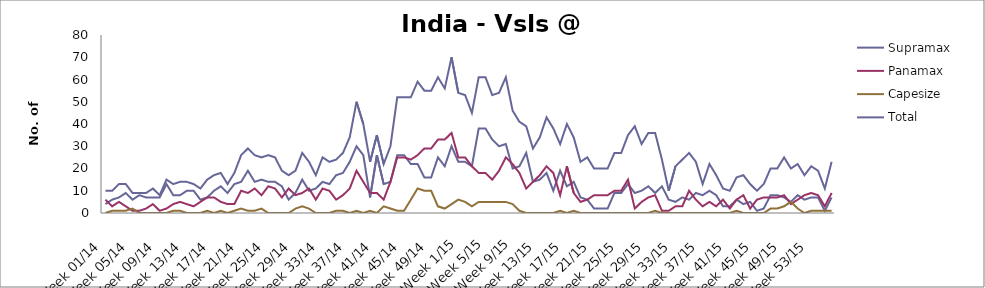
| Category | Supramax | Panamax | Capesize | Total |
|---|---|---|---|---|
| Week 01/14 | 4 | 6 | 0 | 10 |
| Week 02/14 | 6 | 3 | 1 | 10 |
| Week 03/14 | 7 | 5 | 1 | 13 |
| Week 04/14 | 9 | 3 | 1 | 13 |
| Week 05/14 | 6 | 1 | 2 | 9 |
| Week 06/14 | 8 | 1 | 0 | 9 |
| Week 07/14 | 7 | 2 | 0 | 9 |
| Week 08/14 | 7 | 4 | 0 | 11 |
| Week 09/14 | 7 | 1 | 0 | 8 |
| Week 10/14 | 13 | 2 | 0 | 15 |
| Week 11/14 | 8 | 4 | 1 | 13 |
| Week 12/14 | 8 | 5 | 1 | 14 |
| Week 13/14 | 10 | 4 | 0 | 14 |
| Week 14/14 | 10 | 3 | 0 | 13 |
| Week 15/14 | 6 | 5 | 0 | 11 |
| Week 16/14 | 7 | 7 | 1 | 15 |
| Week 17/14 | 10 | 7 | 0 | 17 |
| Week 18/14 | 12 | 5 | 1 | 18 |
| Week 19/14 | 9 | 4 | 0 | 13 |
| Week 20/14 | 13 | 4 | 1 | 18 |
| Week 21/14 | 14 | 10 | 2 | 26 |
| Week 22/14 | 19 | 9 | 1 | 29 |
| Week 23/14 | 14 | 11 | 1 | 26 |
| Week 24/14 | 15 | 8 | 2 | 25 |
| Week 25/14 | 14 | 12 | 0 | 26 |
| Week 26/14 | 14 | 11 | 0 | 25 |
| Week 27/14 | 12 | 7 | 0 | 19 |
| Week 28/14 | 6 | 11 | 0 | 17 |
| Week 29/14 | 9 | 8 | 2 | 19 |
| Week 30/14 | 15 | 9 | 3 | 27 |
| Week 31/14 | 10 | 11 | 2 | 23 |
| Week 32/14 | 11 | 6 | 0 | 17 |
| Week 33/14 | 14 | 11 | 0 | 25 |
| Week 34/14 | 13 | 10 | 0 | 23 |
| Week 35/14 | 17 | 6 | 1 | 24 |
| Week 36/14 | 18 | 8 | 1 | 27 |
| Week 37/14 | 23 | 11 | 0 | 34 |
| Week 38/14 | 30 | 19 | 1 | 50 |
| Week 39/14 | 26 | 14 | 0 | 40 |
| Week 40/14 | 7 | 9 | 1 | 23 |
| Week 41/14 | 26 | 9 | 0 | 35 |
| Week 42/14 | 13 | 6 | 3 | 22 |
| Week 43/14 | 14 | 14 | 2 | 30 |
| Week 44/14 | 26 | 25 | 1 | 52 |
| Week 45/14 | 26 | 25 | 1 | 52 |
| Week 46/14 | 22 | 24 | 6 | 52 |
| Week 47/14 | 22 | 26 | 11 | 59 |
| Week 48/14 | 16 | 29 | 10 | 55 |
| Week 49/14 | 16 | 29 | 10 | 55 |
| Week 50/14 | 25 | 33 | 3 | 61 |
| Week 51/14 | 21 | 33 | 2 | 56 |
| Week 52/14 | 30 | 36 | 4 | 70 |
| Week 1/15 | 23 | 25 | 6 | 54 |
| Week 2/15 | 23 | 25 | 5 | 53 |
| Week 3/15 | 21 | 21 | 3 | 45 |
| Week 4/15 | 38 | 18 | 5 | 61 |
| Week 5/15 | 38 | 18 | 5 | 61 |
| Week 6/15 | 33 | 15 | 5 | 53 |
| Week 7/15 | 30 | 19 | 5 | 54 |
| Week 8/15 | 31 | 25 | 5 | 61 |
| Week 9/15 | 20 | 22 | 4 | 46 |
| Week 10/15 | 21 | 18 | 1 | 41 |
| Week 11/15 | 27 | 11 | 0 | 39 |
| Week 12/15 | 14 | 14 | 0 | 29 |
| Week 13/15 | 15 | 17 | 0 | 34 |
| Week 14/15 | 18 | 21 | 0 | 43 |
| Week 15/15 | 10 | 18 | 0 | 38 |
| Week 16/15 | 19 | 8 | 1 | 31 |
| Week 17/15 | 12 | 21 | 0 | 40 |
| Week 18/15 | 14 | 9 | 1 | 34 |
| Week 19/15 | 7 | 5 | 0 | 23 |
| Week 20/15 | 6 | 6 | 0 | 25 |
| Week 21/15 | 2 | 8 | 0 | 20 |
| Week 22/15 | 2 | 8 | 0 | 20 |
| Week 23/15 | 2 | 8 | 0 | 20 |
| Week 24/15 | 9 | 10 | 0 | 27 |
| Week 25/15 | 9 | 10 | 0 | 27 |
| Week 26/15 | 13 | 15 | 0 | 35 |
| Week 27/15 | 9 | 2 | 0 | 39 |
| Week 28/15 | 10 | 5 | 0 | 31 |
| Week 29/15 | 12 | 7 | 0 | 36 |
| Week 30/15 | 9 | 8 | 1 | 36 |
| Week 31/15 | 12 | 1 | 0 | 24 |
| Week 32/15 | 6 | 1 | 0 | 10 |
| Week 33/15 | 5 | 3 | 0 | 21 |
| Week 34/15 | 7 | 3 | 0 | 24 |
| Week 35/15 | 6 | 10 | 0 | 27 |
| Week 36/15 | 9 | 6 | 0 | 23 |
| Week 37/15 | 8 | 3 | 0 | 13 |
| Week 38/15 | 10 | 5 | 0 | 22 |
| Week 39/15 | 8 | 3 | 0 | 17 |
| Week 40/15 | 3 | 6 | 0 | 11 |
| Week 41/15 | 3 | 2 | 0 | 10 |
| Week 42/15 | 6 | 6 | 1 | 16 |
| Week 43/15 | 4 | 8 | 0 | 17 |
| Week 44/15 | 5 | 2 | 0 | 13 |
| Week 45/15 | 1 | 6 | 0 | 10 |
| Week 46/15 | 2 | 7 | 0 | 13 |
| Week 47/15 | 8 | 7 | 2 | 20 |
| Week 48/15 | 8 | 7 | 2 | 20 |
| Week 49/15 | 7 | 8 | 3 | 25 |
| Week 50/15 | 5 | 4 | 5 | 20 |
| Week 51/15 | 8 | 6 | 2 | 22 |
| Week 52/15 | 6 | 8 | 0 | 17 |
| Week 53/15 | 7 | 9 | 1 | 21 |
| Week 01/16 | 7 | 8 | 1 | 19 |
| Week 02/16 | 1 | 3 | 1 | 11 |
| Week 03/16 | 7 | 9 | 1 | 23 |